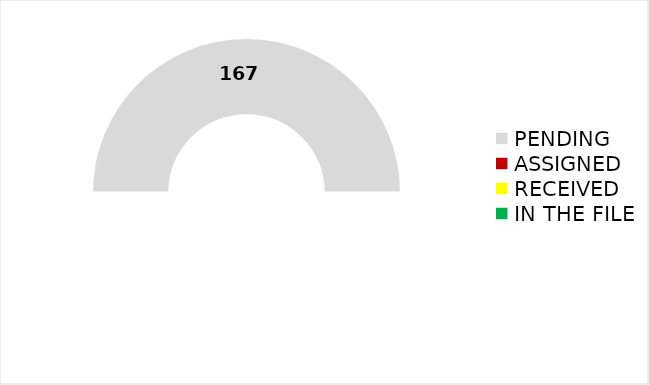
| Category | Series 0 |
|---|---|
| TOTAL | 167 |
| PENDING | 167 |
| ASSIGNED | 0 |
| RECEIVED | 0 |
| IN THE FILE | 0 |